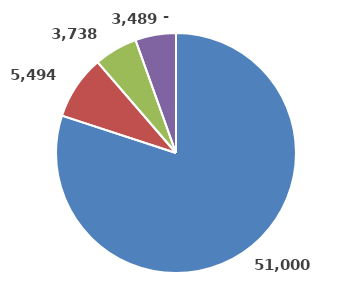
| Category | Series 0 |
|---|---|
| Ineffectiveness | 51000 |
| Sickleave | 5494.362 |
| Fluctuation | 3737.5 |
| Injuries | 3489.454 |
| Strikes | 0 |